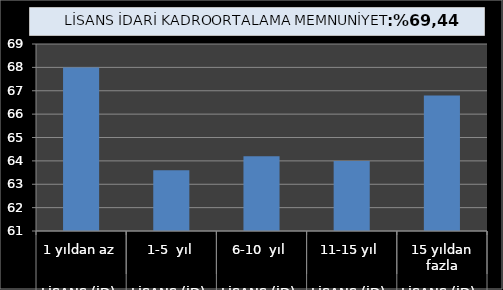
| Category | Series 0 |
|---|---|
| 0 | 68 |
| 1 | 63.6 |
| 2 | 64.2 |
| 3 | 64 |
| 4 | 66.8 |